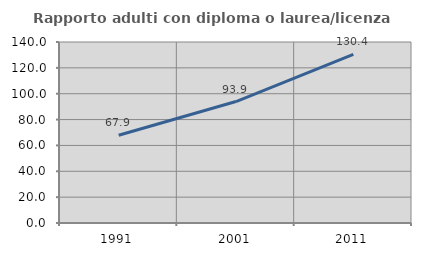
| Category | Rapporto adulti con diploma o laurea/licenza media  |
|---|---|
| 1991.0 | 67.863 |
| 2001.0 | 93.932 |
| 2011.0 | 130.382 |